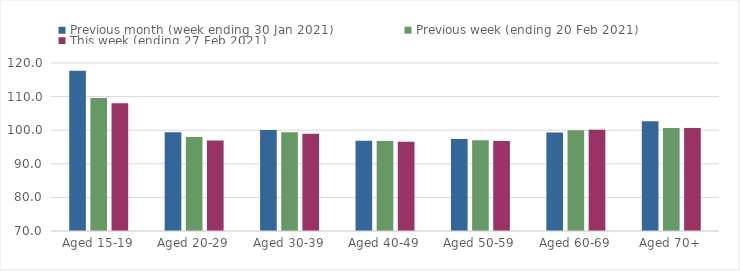
| Category | Previous month (week ending 30 Jan 2021) | Previous week (ending 20 Feb 2021) | This week (ending 27 Feb 2021) |
|---|---|---|---|
| Aged 15-19 | 117.73 | 109.62 | 108.03 |
| Aged 20-29 | 99.4 | 97.98 | 96.93 |
| Aged 30-39 | 100.03 | 99.4 | 98.91 |
| Aged 40-49 | 96.86 | 96.82 | 96.58 |
| Aged 50-59 | 97.38 | 97.04 | 96.77 |
| Aged 60-69 | 99.28 | 100.02 | 100.17 |
| Aged 70+ | 102.68 | 100.69 | 100.65 |